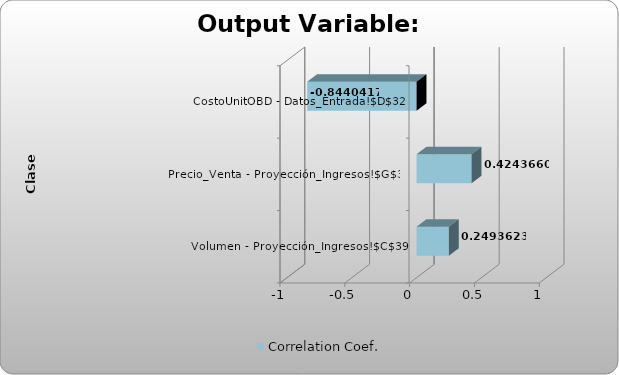
| Category | Correlation Coef. |
|---|---|
| Volumen - Proyección_Ingresos!$C$39 | 0.249 |
| Precio_Venta - Proyección_Ingresos!$G$39 | 0.424 |
| CostoUnitOBD - Datos_Entrada!$D$32 | -0.844 |